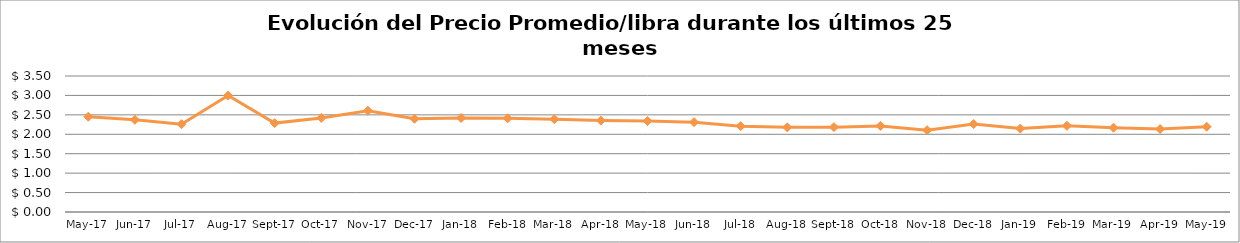
| Category | Series 0 |
|---|---|
| 2017-05-01 | 2.452 |
| 2017-06-01 | 2.372 |
| 2017-07-01 | 2.26 |
| 2017-08-01 | 2.997 |
| 2017-09-01 | 2.288 |
| 2017-10-01 | 2.421 |
| 2017-11-01 | 2.605 |
| 2017-12-01 | 2.4 |
| 2018-01-01 | 2.42 |
| 2018-02-01 | 2.412 |
| 2018-03-01 | 2.388 |
| 2018-04-01 | 2.352 |
| 2018-05-01 | 2.341 |
| 2018-06-01 | 2.312 |
| 2018-07-01 | 2.209 |
| 2018-08-01 | 2.178 |
| 2018-09-01 | 2.184 |
| 2018-10-01 | 2.216 |
| 2018-11-01 | 2.106 |
| 2018-12-01 | 2.264 |
| 2019-01-01 | 2.147 |
| 2019-02-01 | 2.218 |
| 2019-03-01 | 2.169 |
| 2019-04-01 | 2.134 |
| 2019-05-01 | 2.195 |